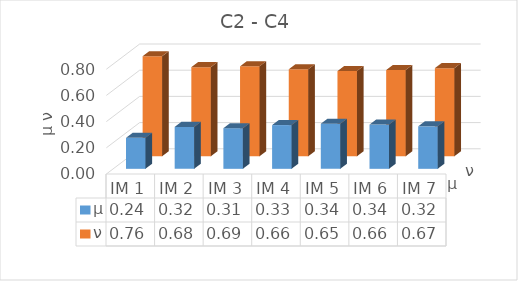
| Category | μ | ν |
|---|---|---|
| IM 1 | 0.236 | 0.764 |
| IM 2 | 0.32 | 0.68 |
| IM 3 | 0.31 | 0.686 |
| IM 4 | 0.334 | 0.664 |
| IM 5 | 0.344 | 0.65 |
| IM 6 | 0.338 | 0.658 |
| IM 7 | 0.324 | 0.673 |